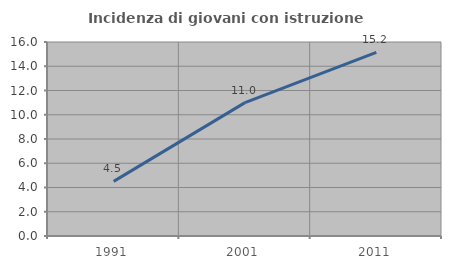
| Category | Incidenza di giovani con istruzione universitaria |
|---|---|
| 1991.0 | 4.505 |
| 2001.0 | 11 |
| 2011.0 | 15.152 |